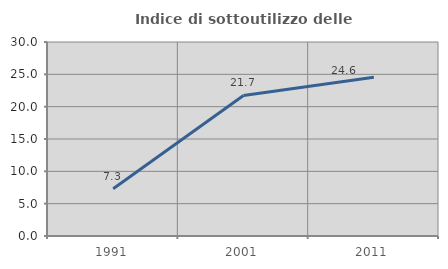
| Category | Indice di sottoutilizzo delle abitazioni  |
|---|---|
| 1991.0 | 7.317 |
| 2001.0 | 21.739 |
| 2011.0 | 24.561 |